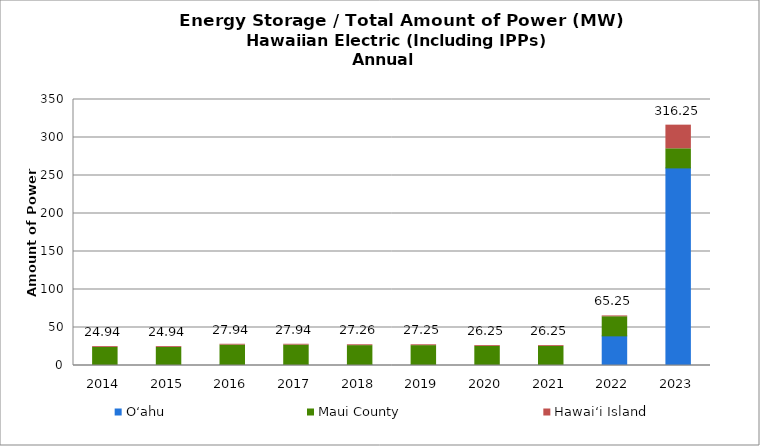
| Category | O‘ahu | Maui County | Hawai‘i Island |
|---|---|---|---|
| 2014.0 | 0.006 | 23.831 | 1.1 |
| 2015.0 | 0.006 | 23.831 | 1.1 |
| 2016.0 | 1.006 | 25.831 | 1.1 |
| 2017.0 | 1.006 | 25.831 | 1.1 |
| 2018.0 | 1.014 | 25.141 | 1.1 |
| 2019.0 | 1.006 | 25.141 | 1.1 |
| 2020.0 | 0.006 | 25.141 | 1.1 |
| 2021.0 | 0.006 | 25.141 | 1.1 |
| 2022.0 | 39.006 | 25.141 | 1.1 |
| 2023.0 | 260.006 | 25.141 | 31.1 |